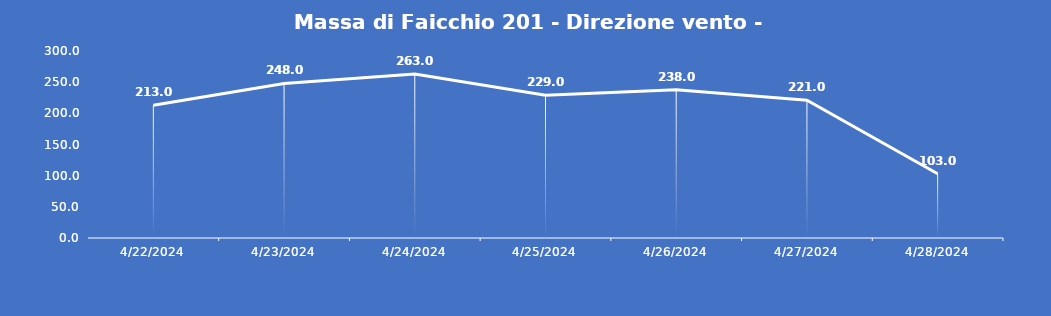
| Category | Massa di Faicchio 201 - Direzione vento - Grezzo (°N) |
|---|---|
| 4/22/24 | 213 |
| 4/23/24 | 248 |
| 4/24/24 | 263 |
| 4/25/24 | 229 |
| 4/26/24 | 238 |
| 4/27/24 | 221 |
| 4/28/24 | 103 |